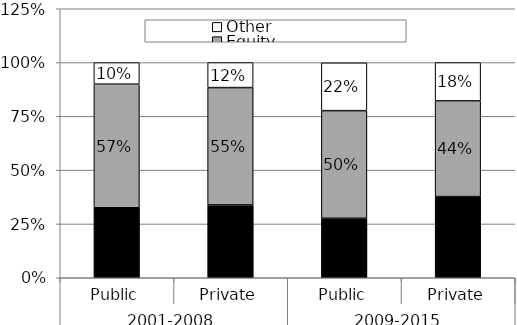
| Category | Fixed income | Equity | Other |
|---|---|---|---|
| 0 | 0.325 | 0.574 | 0.1 |
| 1 | 0.338 | 0.545 | 0.116 |
| 2 | 0.276 | 0.5 | 0.222 |
| 3 | 0.377 | 0.445 | 0.178 |